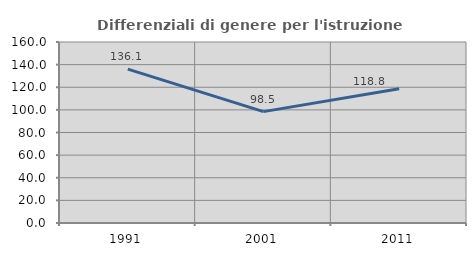
| Category | Differenziali di genere per l'istruzione superiore |
|---|---|
| 1991.0 | 136.05 |
| 2001.0 | 98.467 |
| 2011.0 | 118.756 |